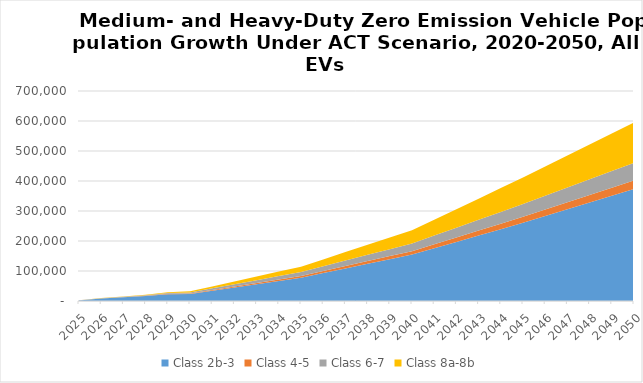
| Category | Class 2b-3 | Class 4-5 | Class 6-7 | Class 8a-8b |
|---|---|---|---|---|
| 2025.0 | 1903.744 | 153.672 | 293.735 | 251.663 |
| 2026.0 | 8206.889 | 326.006 | 654.514 | 562.929 |
| 2027.0 | 12137.086 | 529.29 | 1114.749 | 958.625 |
| 2028.0 | 16940.612 | 799.67 | 1764.756 | 1481.648 |
| 2029.0 | 22789.919 | 1150.673 | 2658.004 | 2170.774 |
| 2030.0 | 23039.199 | 1618.741 | 3910.073 | 3619.05 |
| 2031.0 | 33975.4 | 2441.627 | 5775.286 | 6435.074 |
| 2032.0 | 44911.601 | 3264.513 | 7640.5 | 9251.098 |
| 2033.0 | 55847.802 | 4087.399 | 9505.713 | 12067.122 |
| 2034.0 | 66784.002 | 4910.285 | 11370.927 | 14883.147 |
| 2035.0 | 77720.203 | 5733.172 | 13236.14 | 17699.171 |
| 2036.0 | 93110.03 | 6890.26 | 15739.795 | 22917.747 |
| 2037.0 | 108499.856 | 8047.349 | 18243.45 | 28136.323 |
| 2038.0 | 123889.683 | 9204.437 | 20747.105 | 33354.899 |
| 2039.0 | 139279.51 | 10361.526 | 23250.76 | 38573.474 |
| 2040.0 | 154669.336 | 11518.615 | 25754.415 | 43792.05 |
| 2041.0 | 175860.125 | 13208.668 | 29133.624 | 52664.27 |
| 2042.0 | 197050.913 | 14898.721 | 32512.833 | 61536.49 |
| 2043.0 | 218241.701 | 16588.775 | 35892.042 | 70408.71 |
| 2044.0 | 239432.49 | 18278.828 | 39271.251 | 79280.93 |
| 2045.0 | 260623.278 | 19968.881 | 42650.46 | 88153.15 |
| 2046.0 | 283125.099 | 21670.225 | 45937.078 | 97443.81 |
| 2047.0 | 305626.92 | 23371.568 | 49223.696 | 106734.469 |
| 2048.0 | 328128.741 | 25072.912 | 52510.314 | 116025.128 |
| 2049.0 | 350630.562 | 26774.255 | 55796.931 | 125315.787 |
| 2050.0 | 373132.383 | 28475.599 | 59083.549 | 134606.446 |